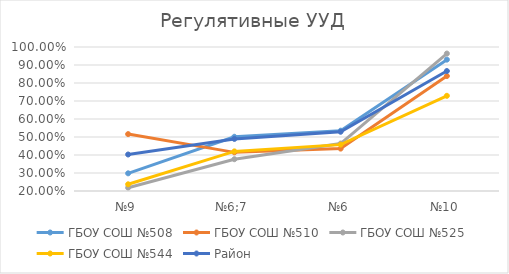
| Category | ГБОУ СОШ №508 | ГБОУ СОШ №510 | ГБОУ СОШ №525 | ГБОУ СОШ №544 | Район |
|---|---|---|---|---|---|
| №9 | 0.298 | 0.516 | 0.218 | 0.237 | 0.403 |
| №6;7 | 0.501 | 0.415 | 0.377 | 0.42 | 0.489 |
| №6 | 0.535 | 0.436 | 0.464 | 0.458 | 0.529 |
| №10 | 0.93 | 0.839 | 0.964 | 0.729 | 0.866 |